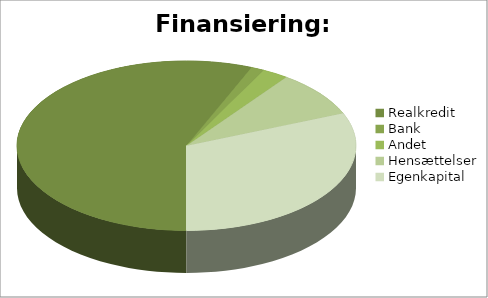
| Category | Series 0 |
|---|---|
| Realkredit | 22500000 |
| Bank | 500000 |
| Andet | 1000000 |
| Hensættelser | 3500000 |
| Egenkapital | 12500000 |